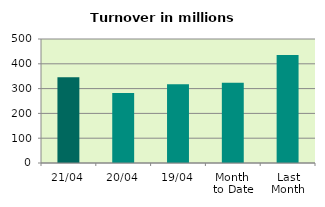
| Category | Series 0 |
|---|---|
| 21/04 | 345.867 |
| 20/04 | 282.491 |
| 19/04 | 317.32 |
| Month 
to Date | 323.331 |
| Last
Month | 435.216 |